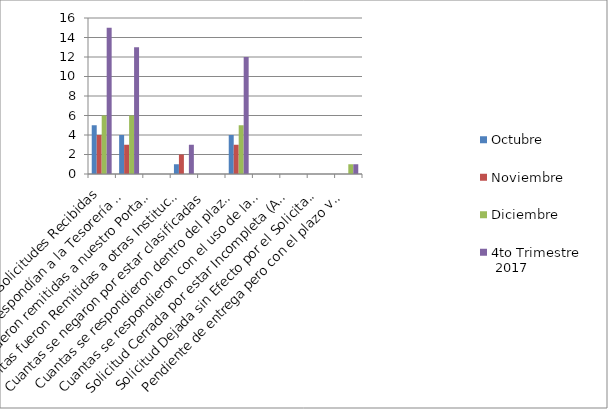
| Category | Octubre | Noviembre | Diciembre | 4to Trimestre
 2017 |
|---|---|---|---|---|
| Total de Solicitudes Recibidas | 5 | 4 | 6 | 15 |
| Cuantas le correspondían a la Tesorería Nacional | 4 | 3 | 6 | 13 |
| Cuantas fueron remitidas a nuestro Portal Web | 0 | 0 | 0 | 0 |
| Cuantas fueron Remitidas a otras Instituciones | 1 | 2 | 0 | 3 |
| Cuantas se negaron por estar clasificadas | 0 | 0 | 0 | 0 |
| Cuantas se respondieron dentro del plazo de los 15 días laborables | 4 | 3 | 5 | 12 |
| Cuantas se respondieron con el uso de la prórroga de 10 días | 0 | 0 | 0 | 0 |
| Solicitud Cerrada por estar Incompleta (Art. 17,Reglamento 130-05) | 0 | 0 | 0 | 0 |
| Solicitud Dejada sin Efecto por el Solicitante | 0 | 0 | 0 | 0 |
| Pendiente de entrega pero con el plazo vigente | 0 | 0 | 1 | 1 |